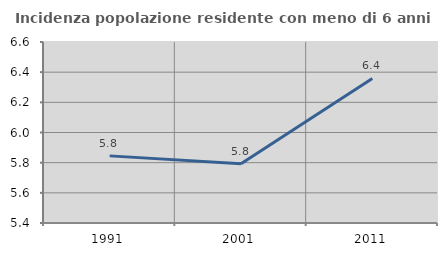
| Category | Incidenza popolazione residente con meno di 6 anni |
|---|---|
| 1991.0 | 5.845 |
| 2001.0 | 5.794 |
| 2011.0 | 6.358 |